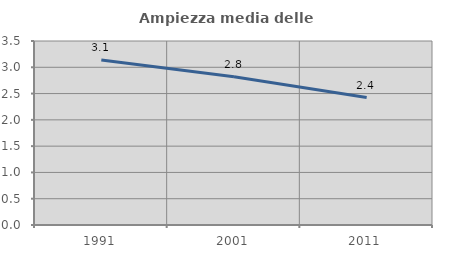
| Category | Ampiezza media delle famiglie |
|---|---|
| 1991.0 | 3.137 |
| 2001.0 | 2.822 |
| 2011.0 | 2.425 |